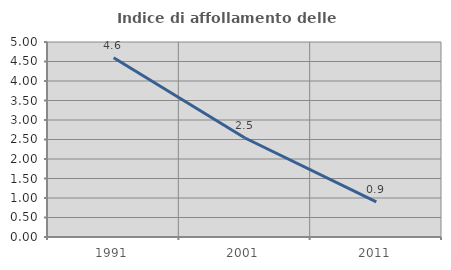
| Category | Indice di affollamento delle abitazioni  |
|---|---|
| 1991.0 | 4.595 |
| 2001.0 | 2.539 |
| 2011.0 | 0.899 |